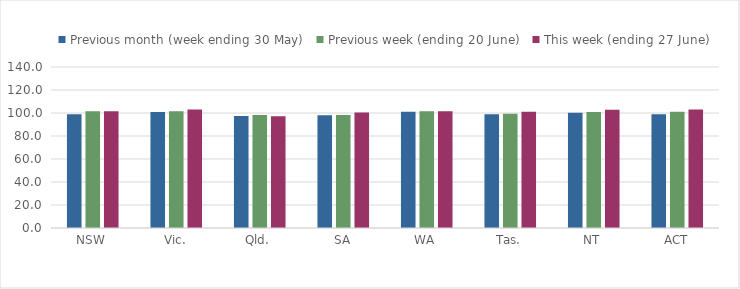
| Category | Previous month (week ending 30 May) | Previous week (ending 20 June) | This week (ending 27 June) |
|---|---|---|---|
| NSW | 99.007 | 101.614 | 101.614 |
| Vic. | 100.918 | 101.525 | 103.106 |
| Qld. | 97.435 | 98.351 | 97.107 |
| SA | 98.044 | 98.199 | 100.425 |
| WA | 101.106 | 101.504 | 101.504 |
| Tas. | 98.892 | 99.396 | 101.178 |
| NT | 100.242 | 100.966 | 102.739 |
| ACT | 98.936 | 101.064 | 103.085 |